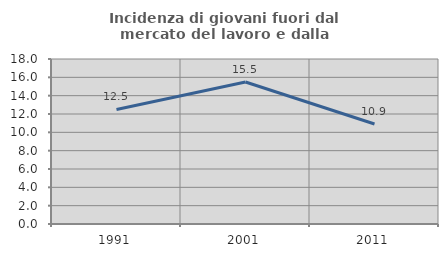
| Category | Incidenza di giovani fuori dal mercato del lavoro e dalla formazione  |
|---|---|
| 1991.0 | 12.5 |
| 2001.0 | 15.493 |
| 2011.0 | 10.909 |